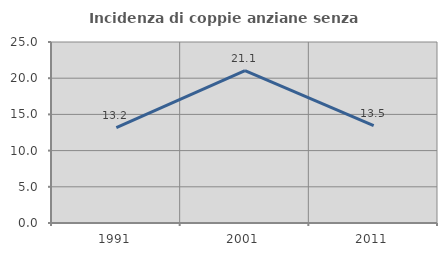
| Category | Incidenza di coppie anziane senza figli  |
|---|---|
| 1991.0 | 13.158 |
| 2001.0 | 21.053 |
| 2011.0 | 13.462 |